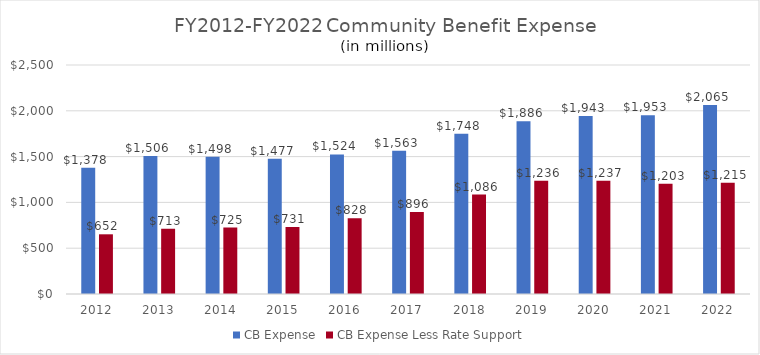
| Category | CB Expense | CB Expense Less Rate Support |
|---|---|---|
| 2012.0 | 1378.302 | 651.687 |
| 2013.0 | 1505.554 | 713.446 |
| 2014.0 | 1498.125 | 724.668 |
| 2015.0 | 1477.303 | 731.202 |
| 2016.0 | 1523.673 | 827.667 |
| 2017.0 | 1562.515 | 895.948 |
| 2018.0 | 1748.442 | 1086.182 |
| 2019.0 | 1885.953 | 1236.025 |
| 2020.0 | 1942.596 | 1236.854 |
| 2021.0 | 1952.576 | 1203.079 |
| 2022.0 | 2064.644 | 1214.88 |